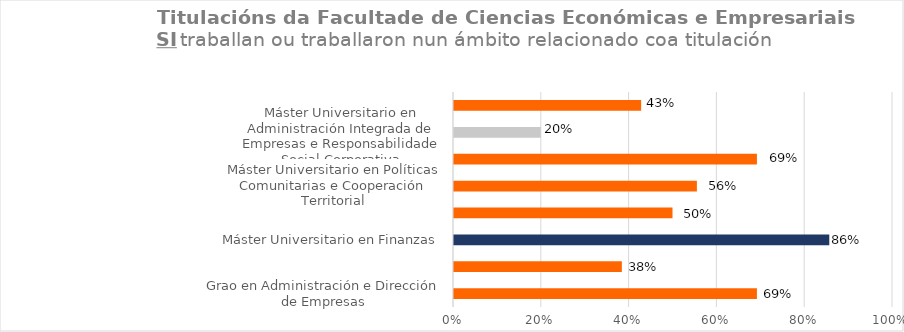
| Category | Series 1 |
|---|---|
| Grao en Administración e Dirección de Empresas | 0.692 |
| Grao en Economía | 0.385 |
| Máster Universitario en Finanzas | 0.857 |
| Máster Universitario en Técnicas Estatísticas | 0.5 |
| Máster Universitario en Políticas Comunitarias e Cooperación Territorial | 0.556 |
| Máster Universitario en Innovación Industrial e Optimización de Procesos | 0.692 |
| Máster Universitario en Administración Integrada de Empresas e Responsabilidade Social Corporativa | 0.2 |
| Máster Universitario en Xestión do Desenvolvemento Sostible | 0.429 |